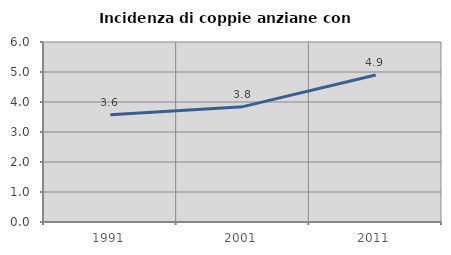
| Category | Incidenza di coppie anziane con figli |
|---|---|
| 1991.0 | 3.575 |
| 2001.0 | 3.845 |
| 2011.0 | 4.9 |